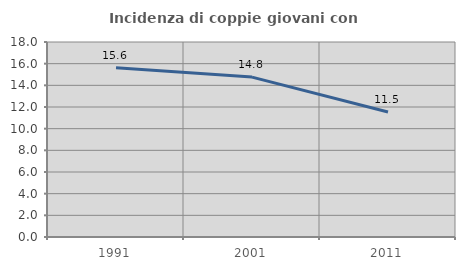
| Category | Incidenza di coppie giovani con figli |
|---|---|
| 1991.0 | 15.612 |
| 2001.0 | 14.761 |
| 2011.0 | 11.535 |